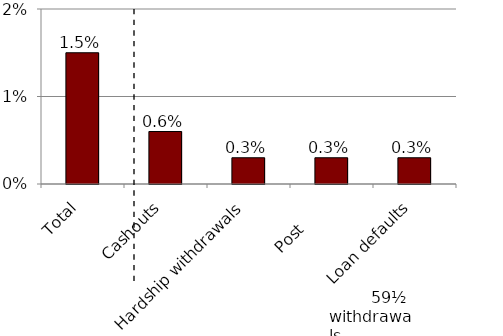
| Category | Series 0 |
|---|---|
| Total | 0.015 |
| Cashouts | 0.006 |
| Hardship withdrawals | 0.003 |
| Post       | 0.003 |
| Loan defaults | 0.003 |